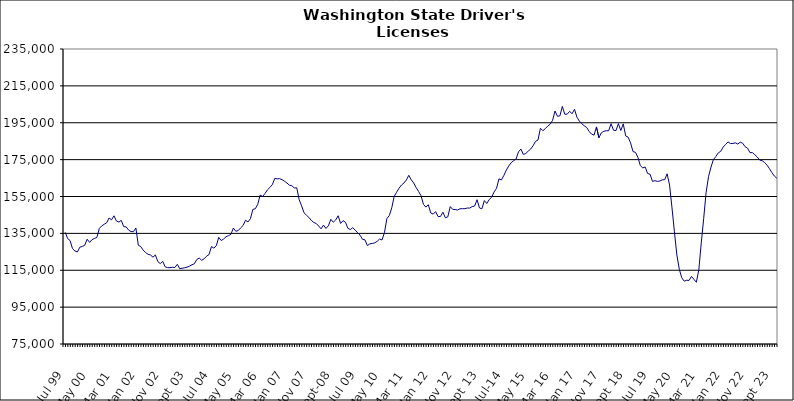
| Category | Series 0 |
|---|---|
| Jul 99 | 135560 |
| Aug 99 | 132182 |
| Sep 99 | 131104 |
| Oct 99 | 126694 |
| Nov 99 | 125425 |
| Dec 99 | 124927 |
| Jan 00 | 127499 |
| Feb 00 | 127927 |
| Mar 00 | 128547 |
| Apr 00 | 131834 |
| May 00 | 130120 |
| Jun 00 | 131595 |
| Jul 00 | 132236 |
| Aug 00 | 132819 |
| Sep 00 | 137711 |
| Oct 00 | 139063 |
| Nov 00 | 139952 |
| Dec 00 | 140732 |
| Jan 01 | 143338 |
| Feb 01 | 142359 |
| Mar 01 | 144523 |
| Apr 01 | 141758 |
| May 01 | 141135 |
| Jun 01 | 142064 |
| Jul 01 | 138646 |
| Aug 01 | 138530 |
| Sep 01 | 136784 |
| Oct 01 | 135996 |
| Nov 01 | 135917 |
| Dec 01 | 137940 |
| Jan 02 | 128531 |
| Feb 02 | 127848 |
| Mar 02 | 125876 |
| Apr 02 | 124595 |
| May 02 | 123660 |
| Jun 02 | 123282 |
| Jul 02 | 122089 |
| Aug 02 | 123279 |
| Sep 02 | 119727 |
| Oct 02 | 118588 |
| Nov 02 | 119854 |
| Dec 02 | 116851 |
| Jan 03 | 116407 |
| Feb 03 | 116382 |
| Mar 03 | 116648 |
| Apr 03 | 116471 |
| May 03 | 118231 |
| Jun 03 | 115831 |
| Jul 03 | 116082 |
| Aug 03 | 116341 |
| Sep 03 | 116653 |
| Oct 03 | 117212 |
| Nov 03 | 117962 |
| Dec 03 | 118542 |
| Jan 04 | 120817 |
| Feb 04 | 121617 |
| Mar 04 | 120369 |
| Apr 04 | 121200 |
| May 04 | 122609 |
| Jun 04 | 123484 |
| Jul 04 | 127844 |
| Aug 04 | 127025 |
| Sep 04 | 128273 |
| Oct 04 | 132853 |
| Nov 04 | 131106 |
| Dec 04 | 131935 |
| Jan 05 | 133205 |
| Feb 05 | 133736 |
| Mar 05 | 134528 |
| Apr 05 | 137889 |
| May 05 | 136130 |
| Jun 05 | 136523 |
| Jul 05 | 137997 |
| Aug 05 | 139294 |
| Sep 05 | 142140 |
| Oct 05 | 141192 |
| Nov 05 | 142937 |
| Dec 05 | 148013 |
| Jan 06 | 148341 |
| Feb 06 | 150744 |
| Mar 06 | 155794 |
| Apr 06 | 154984 |
| May 06 | 156651 |
| Jun 06 | 158638 |
| Jul 06 | 159911 |
| Aug 06 | 161445 |
| Sep 06 | 164852 |
| Oct 06 | 164570 |
| Nov 06 | 164679 |
| Dec 06 | 164127 |
| Jan 07 | 163271 |
| Feb 07 | 162273 |
| Mar 07 | 161140 |
| Apr 07 | 160860 |
| May 07 | 159633 |
| Jun 07 | 159724 |
| Jul 07 | 153303 |
| Aug 07 | 149939 |
| Sep 07 | 146172 |
| Oct 07 | 144876 |
| Nov 07 | 143613 |
| Dec 07 | 142022 |
| Jan 08 | 140909 |
| Feb 08 | 140368 |
| Mar 08 | 138998 |
| Apr 08 | 137471 |
| May 08 | 139453 |
| Jun 08 | 137680 |
| Jul 08 | 139120 |
| Aug 08 | 142612 |
| Sep-08 | 141071 |
| Oct 08 | 142313 |
| Nov 08 | 144556 |
| Dec 08 | 140394 |
| Jan 09 | 141903 |
| Feb 09 | 141036 |
| Mar 09 | 137751 |
| Apr 09 | 137060 |
| May 09 | 138101 |
| Jun 09 | 136739 |
| Jul 09 | 135317 |
| Aug 09 | 134020 |
| Sep 09 | 131756 |
| Oct 09 | 131488 |
| Nov 09 | 128370 |
| Dec 09 | 129323 |
| Jan 10 | 129531 |
| Feb 10 | 129848 |
| Mar 10 | 130654 |
| Apr 10 | 131929 |
| May 10 | 131429 |
| Jun 10 | 135357 |
| Jul 10 | 143032 |
| Aug 10 | 144686 |
| Sep 10 | 148856 |
| Oct 10 | 155042 |
| Nov 10 | 157328 |
| Dec 10 | 159501 |
| Jan 11 | 161221 |
| Feb 11 | 162312 |
| Mar 11 | 163996 |
| Apr 11 | 166495 |
| May 11 | 164040 |
| Jun 11 | 162324 |
| Jul 11 | 159862 |
| Aug 11 | 157738 |
| Sep 11 | 155430 |
| Oct 11 | 150762 |
| Nov 11 | 149255 |
| Dec 11 | 150533 |
| Jan 12 | 146068 |
| Feb 12 | 145446 |
| Mar 12 | 146788 |
| Apr 12 | 144110 |
| May 12 | 144162 |
| Jun 12 | 146482 |
| Jul 12 | 143445 |
| Aug 12 | 143950 |
| Sep 12 | 149520 |
| Oct 12 | 148033 |
| Nov 12 | 147926 |
| Dec 12 | 147674 |
| Jan 13 | 148360 |
| Feb-13 | 148388 |
| Mar-13 | 148414 |
| Apr 13 | 148749 |
| May 13 | 148735 |
| Jun-13 | 149521 |
| Jul 13 | 149837 |
| Aug 13 | 153252 |
| Sep 13 | 148803 |
| Oct 13 | 148315 |
| Nov 13 | 152804 |
| Dec 13 | 151209 |
| Jan 14 | 153357 |
| Feb-14 | 154608 |
| Mar 14 | 157479 |
| Apr 14 | 159441 |
| May 14 | 164591 |
| Jun 14 | 163995 |
| Jul-14 | 166411 |
| Aug-14 | 169272 |
| Sep 14 | 171565 |
| Oct 14 | 173335 |
| Nov 14 | 174406 |
| Dec 14 | 175302 |
| Jan 15 | 179204 |
| Feb 15 | 180737 |
| Mar 15 | 177810 |
| Apr-15 | 178331 |
| May 15 | 179601 |
| Jun-15 | 180729 |
| Jul 15 | 182540 |
| Aug 15 | 184924 |
| Sep 15 | 185620 |
| Oct 15 | 192002 |
| Nov 15 | 190681 |
| Dec 15 | 191795 |
| Jan 16 | 193132 |
| Feb 16 | 194206 |
| Mar 16 | 196319 |
| Apr 16 | 201373 |
| May 16 | 198500 |
| Jun 16 | 198743 |
| Jul 16 | 203841 |
| Aug 16 | 199630 |
| Sep 16 | 199655 |
| Oct 16 | 201181 |
| Nov 16 | 199888 |
| Dec 16 | 202304 |
| Jan 17 | 197977 |
| Feb 17 | 195889 |
| Mar 17 | 194438 |
| Apr 17 | 193335 |
| May 17 | 192430 |
| Jun 17 | 190298 |
| Jul 17 | 188832 |
| Aug 17 | 188264 |
| Sep 17 | 192738 |
| Oct 17 | 186856 |
| Nov 17 | 189537 |
| Dec 17 | 190341 |
| Jan 18 | 190670 |
| Feb 18 | 190645 |
| Mar 18 | 194476 |
| Apr 18 | 190971 |
| May 18 | 190707 |
| Jun 18 | 194516 |
| Jul 18 | 190783 |
| Aug 18 | 194390 |
| Sep 18 | 187831 |
| Oct 18 | 187188 |
| Nov 18 | 184054 |
| Dec 18 | 179347 |
| Jan 19 | 178958 |
| Feb 19 | 176289 |
| Mar 19 | 171747 |
| Apr 19 | 170532 |
| May 19 | 170967 |
| Jun 19 | 167444 |
| Jul 19 | 167059 |
| Aug 19 | 163194 |
| Sep 19 | 163599 |
| Oct 19 | 163212 |
| Nov 19 | 163388 |
| Dec 19 | 164024 |
| Jan 20 | 164114 |
| Feb 20 | 167320 |
| Mar 20 | 161221 |
| Apr 20 | 148866 |
| May 20 | 135821 |
| Jun 20 | 123252 |
| Jul 20 | 115526 |
| Aug 20 | 110940 |
| Sep 20 | 109099 |
| Oct 20 | 109566 |
| Nov 20 | 109488 |
| Dec 20 | 111658 |
| Jan 21 | 110070 |
| Feb 21 | 108491 |
| Mar 21 | 115176 |
| Apr 21 | 129726 |
| May 21 | 143052 |
| Jun 21 | 157253 |
| Jul 21 | 165832 |
| Aug 21 | 170937 |
| Sep 21 | 175042 |
| Oct 21 | 176696 |
| Nov 21 | 178677 |
| Dec 21 | 179501 |
| Jan 22 | 181825 |
| Feb 22 | 183258 |
| Mar 22 | 184618 |
| Apr 22 | 183710 |
| May 22 | 183784 |
| Jun 22 | 184101 |
| Jul 22 | 183443 |
| Aug 22 | 184475 |
| Sep 22 | 183902 |
| Oct 22 | 181994 |
| Nov 22 | 181207 |
| Dec 22 | 178793 |
| Jan 23 | 178782 |
| Feb 23 | 177647 |
| Mar 23 | 176386 |
| Apr 23 | 174729 |
| May 23 | 174390 |
| Jun 23 | 173391 |
| Jul 23 | 171988 |
| Aug 23 | 170100 |
| Sep 23 | 167953 |
| Oct 23 | 166088 |
| Nov 23 | 164934 |